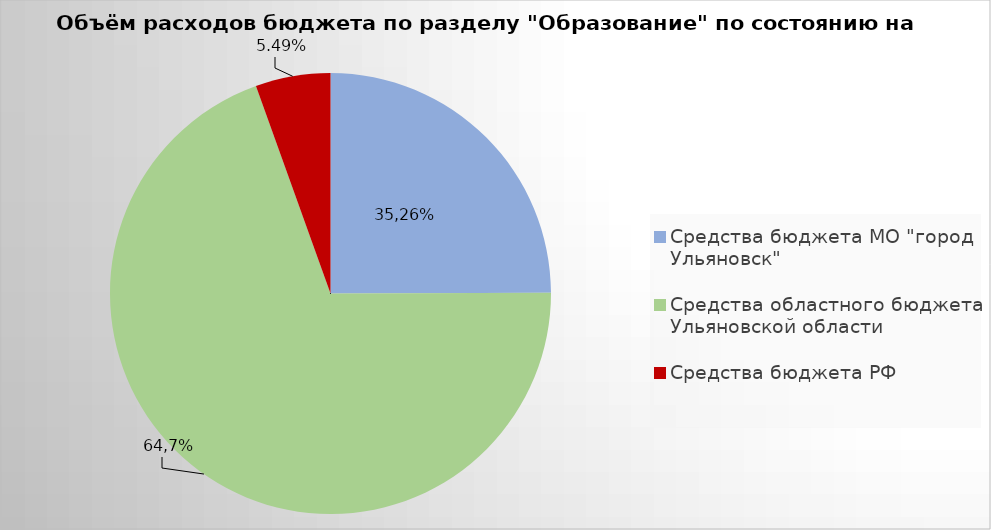
| Category | Series 0 |
|---|---|
| Средства бюджета МО "город Ульяновск" | 2190493.91 |
| Средства областного бюджета Ульяновской области | 6107370.19 |
| Средства бюджета РФ | 481889.61 |